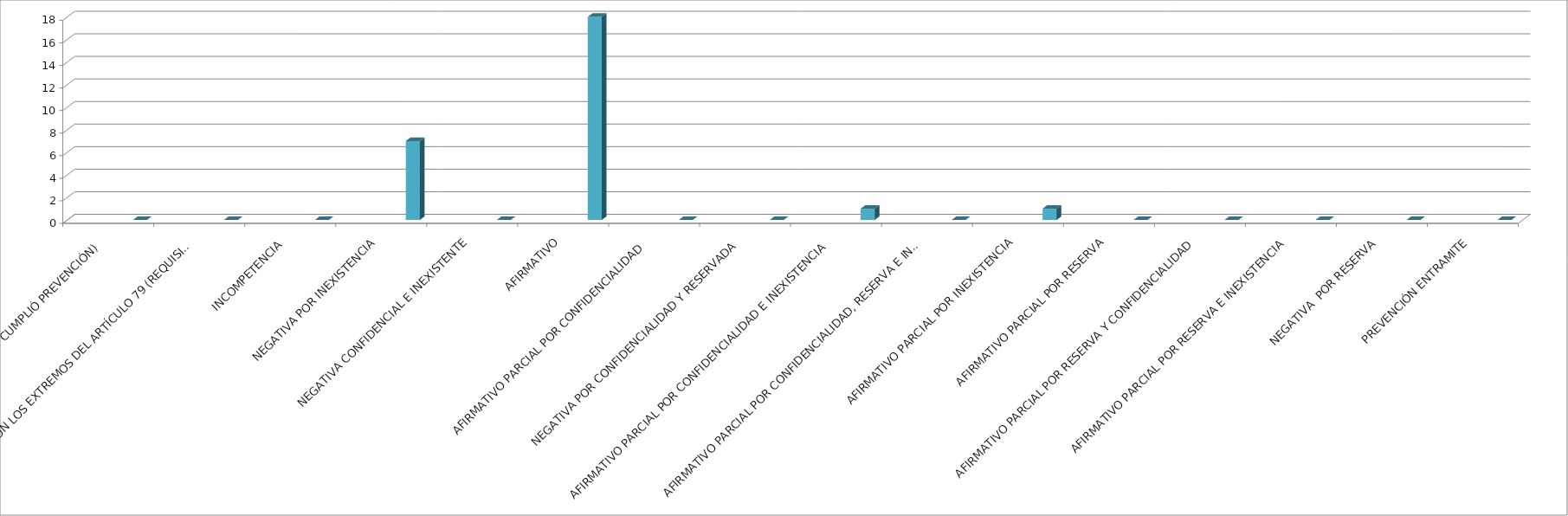
| Category | Series 0 | Series 1 | Series 2 | Series 3 | Series 4 |
|---|---|---|---|---|---|
| SE TIENE POR NO PRESENTADA ( NO CUMPLIÓ PREVENCIÓN) |  |  |  |  | 0 |
| NO CUMPLIO CON LOS EXTREMOS DEL ARTÍCULO 79 (REQUISITOS) |  |  |  |  | 0 |
| INCOMPETENCIA  |  |  |  |  | 0 |
| NEGATIVA POR INEXISTENCIA |  |  |  |  | 7 |
| NEGATIVA CONFIDENCIAL E INEXISTENTE |  |  |  |  | 0 |
| AFIRMATIVO |  |  |  |  | 18 |
| AFIRMATIVO PARCIAL POR CONFIDENCIALIDAD  |  |  |  |  | 0 |
| NEGATIVA POR CONFIDENCIALIDAD Y RESERVADA |  |  |  |  | 0 |
| AFIRMATIVO PARCIAL POR CONFIDENCIALIDAD E INEXISTENCIA |  |  |  |  | 1 |
| AFIRMATIVO PARCIAL POR CONFIDENCIALIDAD, RESERVA E INEXISTENCIA |  |  |  |  | 0 |
| AFIRMATIVO PARCIAL POR INEXISTENCIA |  |  |  |  | 1 |
| AFIRMATIVO PARCIAL POR RESERVA |  |  |  |  | 0 |
| AFIRMATIVO PARCIAL POR RESERVA Y CONFIDENCIALIDAD |  |  |  |  | 0 |
| AFIRMATIVO PARCIAL POR RESERVA E INEXISTENCIA |  |  |  |  | 0 |
| NEGATIVA  POR RESERVA |  |  |  |  | 0 |
| PREVENCIÓN ENTRAMITE |  |  |  |  | 0 |